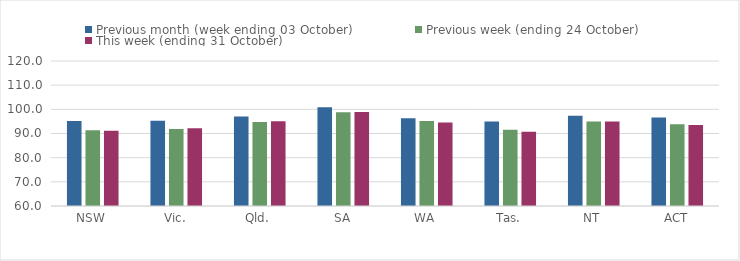
| Category | Previous month (week ending 03 October) | Previous week (ending 24 October) | This week (ending 31 October) |
|---|---|---|---|
| NSW | 95.16 | 91.32 | 91.13 |
| Vic. | 95.25 | 91.89 | 92.13 |
| Qld. | 97.01 | 94.78 | 95.05 |
| SA | 100.89 | 98.77 | 98.87 |
| WA | 96.27 | 95.16 | 94.56 |
| Tas. | 94.92 | 91.59 | 90.69 |
| NT | 97.36 | 94.99 | 94.99 |
| ACT | 96.57 | 93.79 | 93.55 |